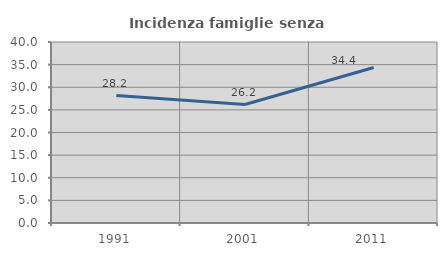
| Category | Incidenza famiglie senza nuclei |
|---|---|
| 1991.0 | 28.161 |
| 2001.0 | 26.181 |
| 2011.0 | 34.356 |